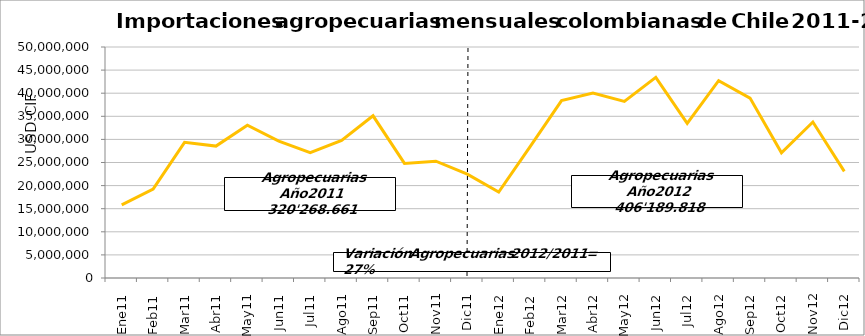
| Category | Agropecuarias |
|---|---|
| 0 | 15809787.85 |
| 1 | 19259447.06 |
| 2 | 29368242.77 |
| 3 | 28554122.32 |
| 4 | 33057812.02 |
| 5 | 29631992.87 |
| 6 | 27155604.34 |
| 7 | 29775493.95 |
| 8 | 35107454.2 |
| 9 | 24808530.58 |
| 10 | 25274580.71 |
| 11 | 22465592.03 |
| 12 | 18588866.92 |
| 13 | 28413844.1 |
| 14 | 38411448.37 |
| 15 | 40033077.49 |
| 16 | 38237054.78 |
| 17 | 43430377.11 |
| 18 | 33474132.31 |
| 19 | 42720544.39 |
| 20 | 38933732.4 |
| 21 | 27097147.21 |
| 22 | 33767060.05 |
| 23 | 23082532.71 |